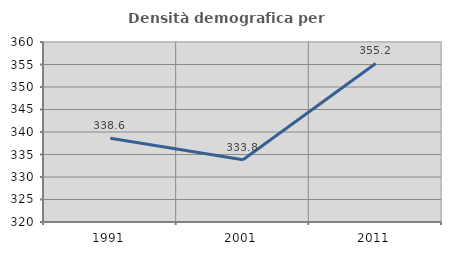
| Category | Densità demografica |
|---|---|
| 1991.0 | 338.624 |
| 2001.0 | 333.828 |
| 2011.0 | 355.229 |